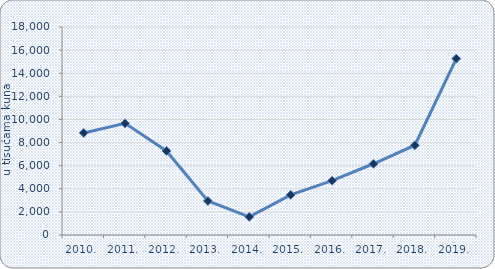
| Category | Neto dobit/gubitak |
|---|---|
| 2010. | 8834.012 |
| 2011. | 9660.586 |
| 2012. | 7269.983 |
| 2013. | 2941.994 |
| 2014. | 1573.345 |
| 2015. | 3469.946 |
| 2016. | 4698.655 |
| 2017. | 6164.85 |
| 2018. | 7767.828 |
| 2019. | 15265.427 |